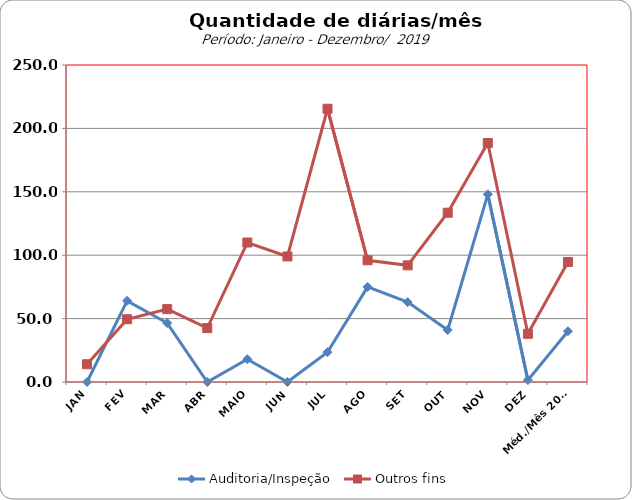
| Category | Auditoria/Inspeção | Outros fins |
|---|---|---|
| JAN | 0 | 14 |
| FEV | 64 | 49.5 |
| MAR | 46.5 | 57.5 |
| ABR | 0 | 42.5 |
| MAIO | 18 | 110 |
| JUN | 0 | 99 |
| JUL | 23.5 | 215.5 |
| AGO | 75 | 96 |
| SET | 63 | 92 |
| OUT | 41 | 133.5 |
| NOV | 148 | 188.5 |
| DEZ | 1.5 | 38 |
| Méd./Mês 2019 | 40.042 | 94.667 |